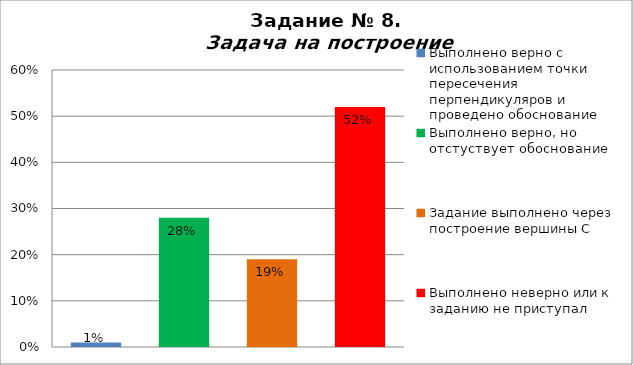
| Category | Задача на построение |
|---|---|
| Выполнено верно с использованием точки пересечения перпендикуляров и проведено обоснование | 0.01 |
| Выполнено верно, но отстуствует обоснование | 0.28 |
| Задание выполнено через построение вершины С | 0.19 |
| Выполнено неверно или к заданию не приступал | 0.52 |